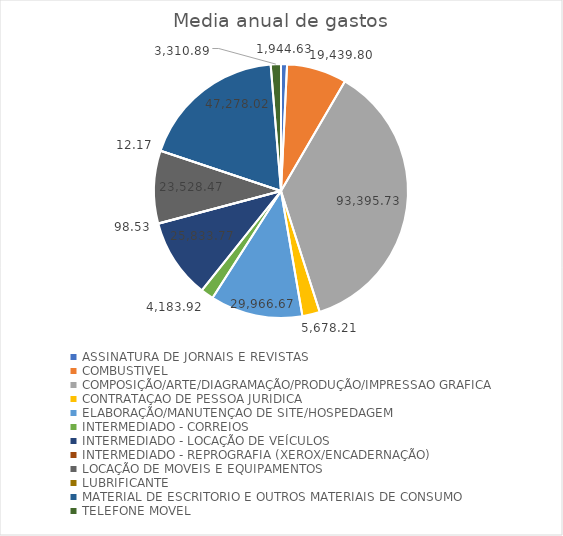
| Category | Series 0 |
|---|---|
| ASSINATURA DE JORNAIS E REVISTAS | 1944.627 |
| COMBUSTIVEL | 19439.797 |
| COMPOSIÇÃO/ARTE/DIAGRAMAÇÃO/PRODUÇÃO/IMPRESSAO GRAFICA | 93395.733 |
| CONTRATAÇAO DE PESSOA JURIDICA | 5678.207 |
| ELABORAÇÃO/MANUTENÇAO DE SITE/HOSPEDAGEM | 29966.667 |
| INTERMEDIADO - CORREIOS | 4183.923 |
| INTERMEDIADO - LOCAÇÃO DE VEÍCULOS | 25833.77 |
| INTERMEDIADO - REPROGRAFIA (XEROX/ENCADERNAÇÃO) | 98.533 |
| LOCAÇÃO DE MOVEIS E EQUIPAMENTOS | 23528.467 |
| LUBRIFICANTE | 12.167 |
| MATERIAL DE ESCRITORIO E OUTROS MATERIAIS DE CONSUMO | 47278.017 |
| TELEFONE MOVEL | 3310.89 |